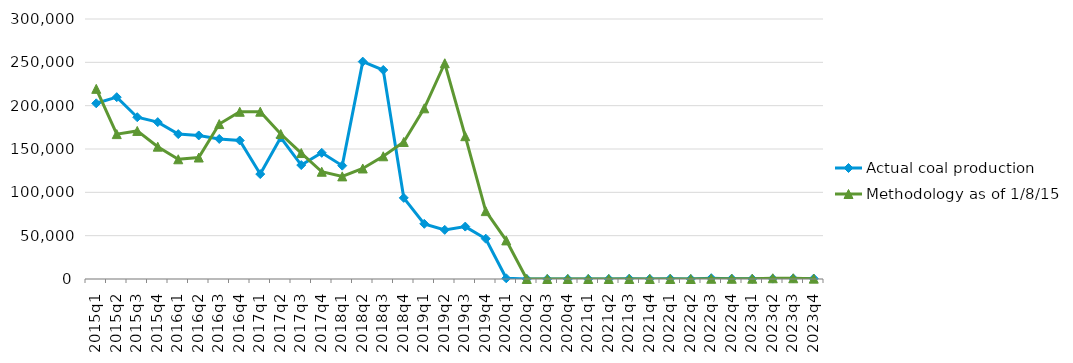
| Category | Actual coal production | Methodology as of 1/8/15 |
|---|---|---|
| 2015q1 | 202720 | 219408 |
| 2015q2 | 209799 | 167170 |
| 2015q3 | 186661 | 170851 |
| 2015q4 | 181019 | 152696 |
| 2016q1 | 167185 | 138151 |
| 2016q2 | 165647 | 140169 |
| 2016q3 | 161575 | 178773 |
| 2016q4 | 159813 | 192962 |
| 2017q1 | 121055 | 193063 |
| 2017q2 | 163213 | 167275 |
| 2017q3 | 131484 | 145346 |
| 2017q4 | 145593 | 123760 |
| 2018q1 | 130772 | 118403 |
| 2018q2 | 250825 | 127524 |
| 2018q3 | 241162 | 141603 |
| 2018q4 | 93621 | 158127 |
| 2019q1 | 63668 | 196937 |
| 2019q2 | 56696 | 248955 |
| 2019q3 | 60477 | 164771 |
| 2019q4 | 46500 | 78320 |
| 2020q1 | 795 | 44548 |
| 2020q2 | 0 | 0 |
| 2020q3 | 0 | 0 |
| 2020q4 | 0 | 0 |
| 2021q1 | 0 | 0 |
| 2021q2 | 0 | 0 |
| 2021q3 | 375 | 0 |
| 2021q4 | 130 | 0 |
| 2022q1 | 386 | 0 |
| 2022q2 | 0 | 0 |
| 2022q3 | 929 | 253 |
| 2022q4 | 428 | 280 |
| 2023q1 | 173 | 341 |
| 2023q2 | 438 | 851 |
| 2023q3 | 618 | 852 |
| 2023q4 | 564 | 417 |